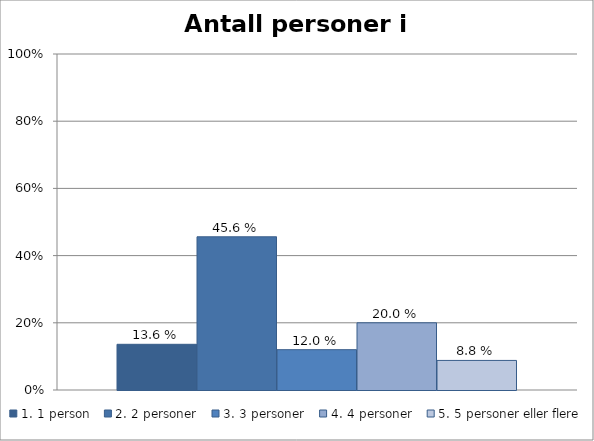
| Category | 1. 1 person | 2. 2 personer | 3. 3 personer | 4. 4 personer | 5. 5 personer eller flere |
|---|---|---|---|---|---|
| Antall personer i husstanden | 0.136 | 0.456 | 0.12 | 0.2 | 0.088 |